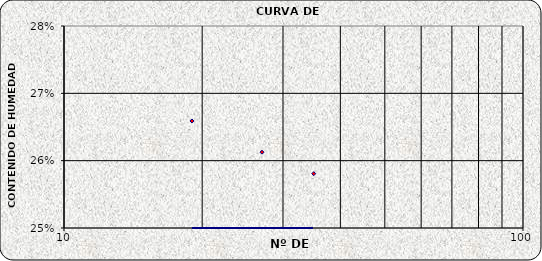
| Category | Series 0 |
|---|---|
| 35.0 | 0.258 |
| 27.0 | 0.261 |
| 19.0 | 0.266 |